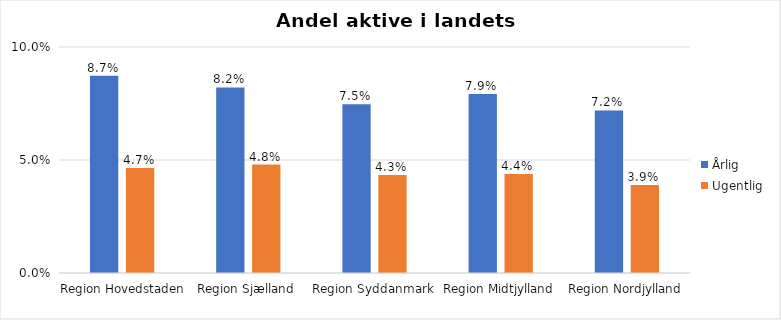
| Category | Årlig | Ugentlig |
|---|---|---|
| Region Hovedstaden | 0.087 | 0.047 |
| Region Sjælland | 0.082 | 0.048 |
| Region Syddanmark | 0.075 | 0.043 |
| Region Midtjylland | 0.079 | 0.044 |
| Region Nordjylland | 0.072 | 0.039 |